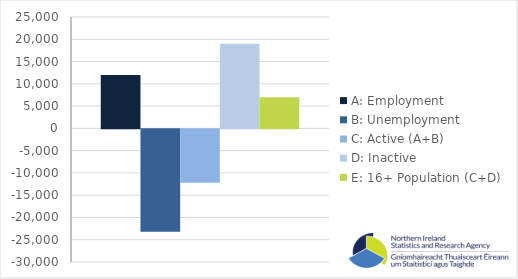
| Category | A: Employment | B: Unemployment | C: Active (A+B) | D: Inactive | E: 16+ Population (C+D) |
|---|---|---|---|---|---|
| 0 | 12000 | -23000 | -12000 | 19000 | 7000 |